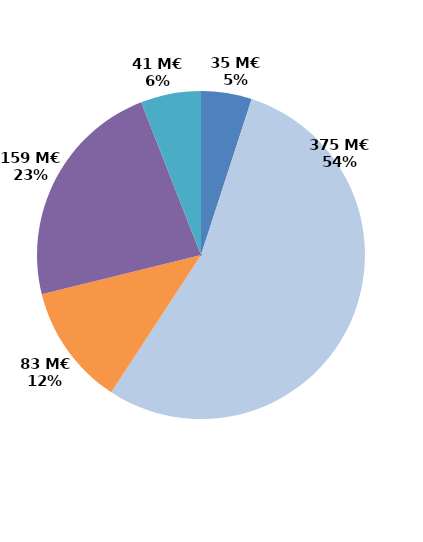
| Category | Series 0 |
|---|---|
| Contrats aidés marchand (hors IAE) | 34.637 |
| Contrats aidés non marchand (hors IAE) | 375.496 |
| Insertion par l'activité économique | 82.619 |
| Mesures en faveur des handicapés | 158.668 |
| Autres emplois aidés | 41.144 |